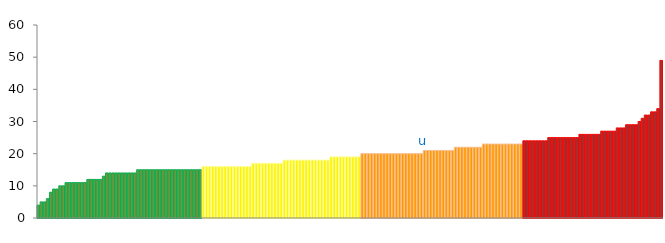
| Category | Top Quartile | 2nd Quartile | 3rd Quartile | Bottom Quartile | Series 4 |
|---|---|---|---|---|---|
|  | 4 | 0 | 0 | 0 | 4 |
|  | 5 | 0 | 0 | 0 | 5 |
|  | 5 | 0 | 0 | 0 | 5 |
|  | 6 | 0 | 0 | 0 | 6 |
|  | 8 | 0 | 0 | 0 | 8 |
|  | 9 | 0 | 0 | 0 | 9 |
|  | 9 | 0 | 0 | 0 | 9 |
|  | 10 | 0 | 0 | 0 | 10 |
|  | 10 | 0 | 0 | 0 | 10 |
|  | 11 | 0 | 0 | 0 | 11 |
|  | 11 | 0 | 0 | 0 | 11 |
|  | 11 | 0 | 0 | 0 | 11 |
|  | 11 | 0 | 0 | 0 | 11 |
|  | 11 | 0 | 0 | 0 | 11 |
|  | 11 | 0 | 0 | 0 | 11 |
|  | 11 | 0 | 0 | 0 | 11 |
|  | 12 | 0 | 0 | 0 | 12 |
|  | 12 | 0 | 0 | 0 | 12 |
|  | 12 | 0 | 0 | 0 | 12 |
|  | 12 | 0 | 0 | 0 | 12 |
|  | 12 | 0 | 0 | 0 | 12 |
|  | 13 | 0 | 0 | 0 | 13 |
|  | 14 | 0 | 0 | 0 | 14 |
|  | 14 | 0 | 0 | 0 | 14 |
|  | 14 | 0 | 0 | 0 | 14 |
|  | 14 | 0 | 0 | 0 | 14 |
|  | 14 | 0 | 0 | 0 | 14 |
|  | 14 | 0 | 0 | 0 | 14 |
|  | 14 | 0 | 0 | 0 | 14 |
|  | 14 | 0 | 0 | 0 | 14 |
|  | 14 | 0 | 0 | 0 | 14 |
|  | 14 | 0 | 0 | 0 | 14 |
|  | 15 | 0 | 0 | 0 | 15 |
|  | 15 | 0 | 0 | 0 | 15 |
|  | 15 | 0 | 0 | 0 | 15 |
|  | 15 | 0 | 0 | 0 | 15 |
|  | 15 | 0 | 0 | 0 | 15 |
|  | 15 | 0 | 0 | 0 | 15 |
|  | 15 | 0 | 0 | 0 | 15 |
|  | 15 | 0 | 0 | 0 | 15 |
|  | 15 | 0 | 0 | 0 | 15 |
|  | 15 | 0 | 0 | 0 | 15 |
|  | 15 | 0 | 0 | 0 | 15 |
|  | 15 | 0 | 0 | 0 | 15 |
|  | 15 | 0 | 0 | 0 | 15 |
|  | 15 | 0 | 0 | 0 | 15 |
|  | 15 | 0 | 0 | 0 | 15 |
|  | 15 | 0 | 0 | 0 | 15 |
|  | 15 | 0 | 0 | 0 | 15 |
|  | 15 | 0 | 0 | 0 | 15 |
|  | 15 | 0 | 0 | 0 | 15 |
|  | 15 | 0 | 0 | 0 | 15 |
|  | 15 | 0 | 0 | 0 | 15 |
|  | 0 | 16 | 0 | 0 | 16 |
|  | 0 | 16 | 0 | 0 | 16 |
|  | 0 | 16 | 0 | 0 | 16 |
|  | 0 | 16 | 0 | 0 | 16 |
|  | 0 | 16 | 0 | 0 | 16 |
|  | 0 | 16 | 0 | 0 | 16 |
|  | 0 | 16 | 0 | 0 | 16 |
|  | 0 | 16 | 0 | 0 | 16 |
|  | 0 | 16 | 0 | 0 | 16 |
|  | 0 | 16 | 0 | 0 | 16 |
|  | 0 | 16 | 0 | 0 | 16 |
|  | 0 | 16 | 0 | 0 | 16 |
|  | 0 | 16 | 0 | 0 | 16 |
|  | 0 | 16 | 0 | 0 | 16 |
|  | 0 | 16 | 0 | 0 | 16 |
|  | 0 | 16 | 0 | 0 | 16 |
|  | 0 | 17 | 0 | 0 | 17 |
|  | 0 | 17 | 0 | 0 | 17 |
|  | 0 | 17 | 0 | 0 | 17 |
|  | 0 | 17 | 0 | 0 | 17 |
|  | 0 | 17 | 0 | 0 | 17 |
|  | 0 | 17 | 0 | 0 | 17 |
|  | 0 | 17 | 0 | 0 | 17 |
|  | 0 | 17 | 0 | 0 | 17 |
|  | 0 | 17 | 0 | 0 | 17 |
|  | 0 | 17 | 0 | 0 | 17 |
|  | 0 | 18 | 0 | 0 | 18 |
|  | 0 | 18 | 0 | 0 | 18 |
|  | 0 | 18 | 0 | 0 | 18 |
|  | 0 | 18 | 0 | 0 | 18 |
|  | 0 | 18 | 0 | 0 | 18 |
|  | 0 | 18 | 0 | 0 | 18 |
|  | 0 | 18 | 0 | 0 | 18 |
|  | 0 | 18 | 0 | 0 | 18 |
|  | 0 | 18 | 0 | 0 | 18 |
|  | 0 | 18 | 0 | 0 | 18 |
|  | 0 | 18 | 0 | 0 | 18 |
|  | 0 | 18 | 0 | 0 | 18 |
|  | 0 | 18 | 0 | 0 | 18 |
|  | 0 | 18 | 0 | 0 | 18 |
|  | 0 | 18 | 0 | 0 | 18 |
|  | 0 | 19 | 0 | 0 | 19 |
|  | 0 | 19 | 0 | 0 | 19 |
|  | 0 | 19 | 0 | 0 | 19 |
|  | 0 | 19 | 0 | 0 | 19 |
|  | 0 | 19 | 0 | 0 | 19 |
|  | 0 | 19 | 0 | 0 | 19 |
|  | 0 | 19 | 0 | 0 | 19 |
|  | 0 | 19 | 0 | 0 | 19 |
|  | 0 | 19 | 0 | 0 | 19 |
|  | 0 | 19 | 0 | 0 | 19 |
|  | 0 | 0 | 20 | 0 | 20 |
|  | 0 | 0 | 20 | 0 | 20 |
|  | 0 | 0 | 20 | 0 | 20 |
|  | 0 | 0 | 20 | 0 | 20 |
|  | 0 | 0 | 20 | 0 | 20 |
|  | 0 | 0 | 20 | 0 | 20 |
|  | 0 | 0 | 20 | 0 | 20 |
|  | 0 | 0 | 20 | 0 | 20 |
|  | 0 | 0 | 20 | 0 | 20 |
|  | 0 | 0 | 20 | 0 | 20 |
|  | 0 | 0 | 20 | 0 | 20 |
|  | 0 | 0 | 20 | 0 | 20 |
|  | 0 | 0 | 20 | 0 | 20 |
|  | 0 | 0 | 20 | 0 | 20 |
|  | 0 | 0 | 20 | 0 | 20 |
|  | 0 | 0 | 20 | 0 | 20 |
|  | 0 | 0 | 20 | 0 | 20 |
|  | 0 | 0 | 20 | 0 | 20 |
|  | 0 | 0 | 20 | 0 | 20 |
|  | 0 | 0 | 20 | 0 | 20 |
| u | 0 | 0 | 21 | 0 | 21 |